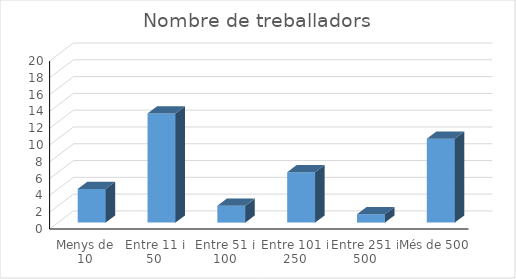
| Category | Series 0 |
|---|---|
| Menys de 10 | 4 |
| Entre 11 i 50 | 13 |
| Entre 51 i 100 | 2 |
| Entre 101 i 250 | 6 |
| Entre 251 i 500 | 1 |
| Més de 500 | 10 |